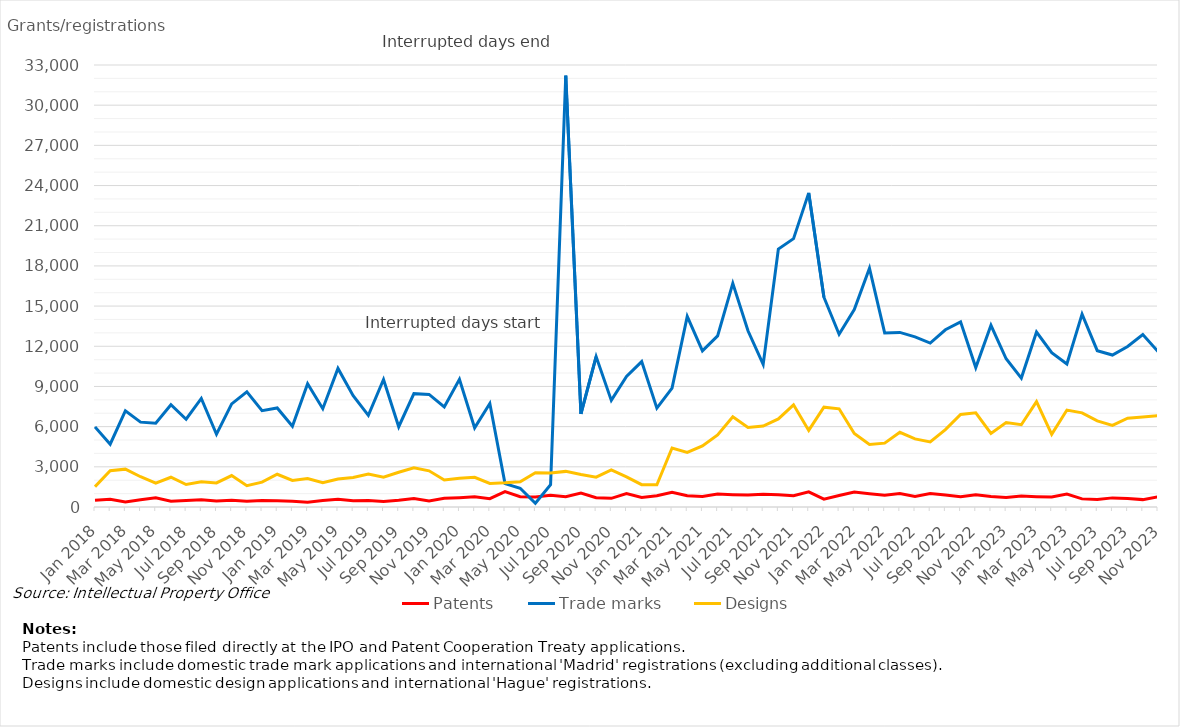
| Category | Patents | Trade marks | Designs |
|---|---|---|---|
| Jan 2018 | 495 | 5981 | 1512 |
| Feb 2018 | 574 | 4688 | 2704 |
| Mar 2018 | 370 | 7180 | 2825 |
| Apr 2018 | 543 | 6335 | 2259 |
| May 2018 | 690 | 6254 | 1789 |
| Jun 2018 | 424 | 7637 | 2222 |
| Jul 2018 | 486 | 6552 | 1678 |
| Aug 2018 | 536 | 8104 | 1878 |
| Sep 2018 | 450 | 5432 | 1795 |
| Oct 2018 | 498 | 7701 | 2348 |
| Nov 2018 | 432 | 8604 | 1592 |
| Dec 2018 | 484 | 7195 | 1859 |
| Jan 2019 | 474 | 7396 | 2444 |
| Feb 2019 | 426 | 6023 | 1987 |
| Mar 2019 | 363 | 9208 | 2125 |
| Apr 2019 | 488 | 7341 | 1810 |
| May 2019 | 573 | 10347 | 2096 |
| Jun 2019 | 471 | 8305 | 2202 |
| Jul 2019 | 489 | 6840 | 2464 |
| Aug 2019 | 420 | 9519 | 2218 |
| Sep 2019 | 500 | 5992 | 2596 |
| Oct 2019 | 634 | 8464 | 2926 |
| Nov 2019 | 455 | 8405 | 2700 |
| Dec 2019 | 654 | 7470 | 2021 |
| Jan 2020 | 696 | 9528 | 2145 |
| Feb 2020 | 756 | 5911 | 2219 |
| Mar 2020 | 622 | 7723 | 1757 |
| Apr 2020 | 1143 | 1744 | 1803 |
| May 2020 | 768 | 1400 | 1888 |
| Jun 2020 | 740 | 282 | 2564 |
| Jul 2020 | 878 | 1660 | 2539 |
| Aug 2020 | 771 | 32206 | 2659 |
| Sep 2020 | 1042 | 6950 | 2425 |
| Oct 2020 | 697 | 11228 | 2223 |
| Nov 2020 | 649 | 7958 | 2763 |
| Dec 2020 | 1010 | 9753 | 2252 |
| Jan 2021 | 708 | 10856 | 1665 |
| Feb 2021 | 838 | 7384 | 1660 |
| Mar 2021 | 1107 | 8879 | 4408 |
| Apr 2021 | 838 | 14236 | 4074 |
| May 2021 | 788 | 11656 | 4562 |
| Jun 2021 | 972 | 12775 | 5385 |
| Jul 2021 | 918 | 16701 | 6731 |
| Aug 2021 | 887 | 13153 | 5944 |
| Sep 2021 | 947 | 10650 | 6041 |
| Oct 2021 | 920 | 19256 | 6577 |
| Nov 2021 | 841 | 20034 | 7629 |
| Dec 2021 | 1131 | 23453 | 5719 |
| Jan 2022 | 585 | 15664 | 7455 |
| Feb 2022 | 860 | 12901 | 7329 |
| Mar 2022 | 1111 | 14746 | 5482 |
| Apr 2022 | 990 | 17823 | 4662 |
| May 2022 | 883 | 12996 | 4767 |
| Jun 2022 | 1010 | 13035 | 5577 |
| Jul 2022 | 788 | 12703 | 5082 |
| Aug 2022 | 1007 | 12238 | 4856 |
| Sep 2022 | 889 | 13232 | 5776 |
| Oct 2022 | 758 | 13821 | 6904 |
| Nov 2022 | 920 | 10408 | 7027 |
| Dec 2022 | 777 | 13567 | 5498 |
| Jan 2023 | 708 | 11068 | 6304 |
| Feb 2023 | 817 | 9627 | 6141 |
| Mar 2023 | 770 | 13066 | 7872 |
| Apr 2023 | 747 | 11525 | 5420 |
| May 2023 | 963 | 10678 | 7237 |
| Jun 2023 | 606 | 14401 | 7032 |
| Jul 2023 | 561 | 11674 | 6425 |
| Aug 2023 | 681 | 11345 | 6095 |
| Sep 2023 | 638 | 11981 | 6631 |
| Oct 2023 | 551 | 12881 | 6727 |
| Nov 2023 | 762 | 11604 | 6815 |